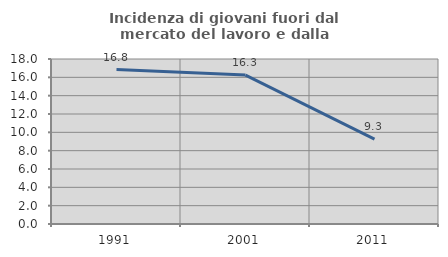
| Category | Incidenza di giovani fuori dal mercato del lavoro e dalla formazione  |
|---|---|
| 1991.0 | 16.846 |
| 2001.0 | 16.25 |
| 2011.0 | 9.268 |